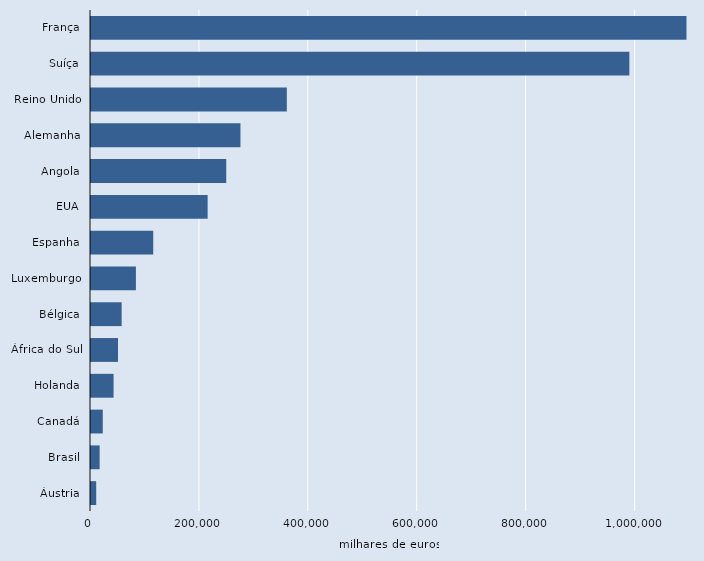
| Category | Series 2 |
|---|---|
| França | 1093540 |
| Suíça | 988660 |
| Reino Unido | 359620 |
| Alemanha | 274470 |
| Angola | 248360 |
| EUA | 214200 |
| Espanha | 114280 |
| Luxemburgo | 82470 |
| Bélgica | 56280 |
| África do Sul | 49600 |
| Holanda | 41440 |
| Canadá | 21610 |
| Brasil | 15890 |
| Áustria | 9550 |